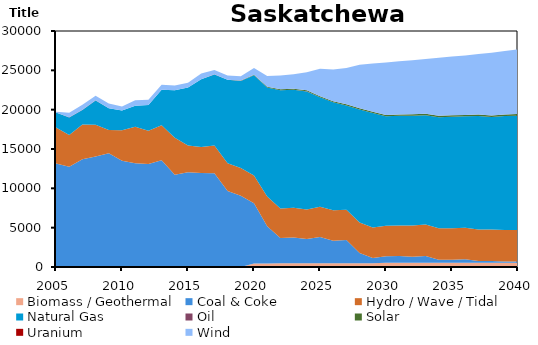
| Category | Biomass / Geothermal | Coal & Coke | Hydro / Wave / Tidal | Natural Gas | Oil | Solar | Uranium | Wind |
|---|---|---|---|---|---|---|---|---|
| 2005.0 | 0 | 13157.72 | 4573 | 1896.283 | 17.9 | 0 | 0 | 92 |
| 2006.0 | 0 | 12734.72 | 4032 | 2247.283 | 19.5 | 0 | 0 | 573 |
| 2007.0 | 0 | 13706.72 | 4393 | 1869.283 | 25.9 | 0 | 0 | 620 |
| 2008.0 | 0 | 14055.07 | 4030 | 3083.935 | 22.6 | 0 | 0 | 574 |
| 2009.0 | 0 | 14446.21 | 2962 | 2763.792 | 17.9 | 0 | 0 | 579 |
| 2010.0 | 0 | 13510.41 | 3866 | 2503.593 | 20.8 | 0 | 0 | 507 |
| 2011.0 | 0 | 13181.21 | 4641 | 2678.787 | 12.3 | 0 | 0 | 682 |
| 2012.0 | 0 | 13089.82 | 4240 | 3253.184 | 11.3 | 0 | 0 | 655 |
| 2013.0 | 0 | 13578.27 | 4449 | 4493.73 | 15 | 0 | 0 | 646 |
| 2014.0 | 0 | 11726.75 | 4706.09 | 6022.449 | 12.4 | 0 | 0 | 615.264 |
| 2015.0 | 0 | 12030.72 | 3425.611 | 7352.383 | 2 | 0 | 0 | 619.832 |
| 2016.0 | 0 | 11961.09 | 3284.769 | 8614.611 | 1.1 | 0 | 0 | 730.283 |
| 2017.0 | 0 | 11920.31 | 3525 | 9040.29 | 1.2 | 0 | 0 | 542.11 |
| 2018.0 | 0 | 9671.481 | 3525.01 | 10592.28 | 8.199 | 0 | 0 | 542.112 |
| 2019.0 | 0 | 9047.66 | 3524.996 | 11084.91 | 8.199 | 35.04 | 0 | 542.109 |
| 2020.0 | 437.999 | 7670.2 | 3524.994 | 12729.59 | 8.199 | 70.08 | 0 | 848.708 |
| 2021.0 | 437.998 | 4755.693 | 3759.108 | 13853.93 | 8.199 | 105.12 | 0 | 1348.768 |
| 2022.0 | 481.798 | 3198.948 | 3759.099 | 15012.67 | 8.199 | 131.4 | 0 | 1737.161 |
| 2023.0 | 481.799 | 3282.606 | 3759.119 | 15002.73 | 8.199 | 131.4 | 0 | 1824.169 |
| 2024.0 | 481.799 | 3077.798 | 3759.153 | 15005.53 | 8.199 | 131.4 | 0 | 2297.206 |
| 2025.0 | 481.801 | 3329.343 | 3862.273 | 13890.58 | 0.083 | 131.4 | 0 | 3491.768 |
| 2026.0 | 481.8 | 2859.033 | 3862.291 | 13727.64 | 0.083 | 131.4 | 0 | 4054.135 |
| 2027.0 | 481.8 | 2945.776 | 3862.292 | 13232.59 | 0.083 | 157.68 | 0 | 4617.093 |
| 2028.0 | 481.8 | 1301.378 | 3862.292 | 14378.05 | 0.083 | 157.68 | 0 | 5540.767 |
| 2029.0 | 481.799 | 661.982 | 3862.285 | 14580.2 | 0.083 | 157.68 | 0 | 6109.91 |
| 2030.0 | 525.599 | 843.19 | 3862.309 | 13937.97 | 0.083 | 157.68 | 0 | 6679.284 |
| 2031.0 | 525.601 | 877.692 | 3862.291 | 13966.71 | 0.083 | 157.68 | 0 | 6775.755 |
| 2032.0 | 525.6 | 787.271 | 3965.427 | 13954.01 | 0.083 | 183.96 | 0 | 6872.534 |
| 2033.0 | 525.601 | 880.409 | 4001.367 | 13888.46 | 0.083 | 183.96 | 0 | 6967.61 |
| 2034.0 | 525.601 | 406.563 | 4001.336 | 14109.75 | 0.083 | 183.96 | 0 | 7369.602 |
| 2035.0 | 525.6 | 411.773 | 4001.377 | 14167.3 | 0.083 | 183.96 | 0 | 7466.247 |
| 2036.0 | 525.6 | 458.651 | 4001.391 | 14167.96 | 0.083 | 183.96 | 0 | 7563.765 |
| 2037.0 | 525.599 | 247.242 | 4001.384 | 14414.81 | 0.083 | 210.24 | 0 | 7661.881 |
| 2038.0 | 525.599 | 247.242 | 4001.386 | 14279.11 | 0.083 | 210.24 | 0 | 7968.488 |
| 2039.0 | 525.6 | 172.866 | 4001.333 | 14482.17 | 0.083 | 210.24 | 0 | 8079.412 |
| 2040.0 | 525.6 | 172.866 | 4001.326 | 14543 | 0.083 | 210.24 | 0 | 8193.141 |